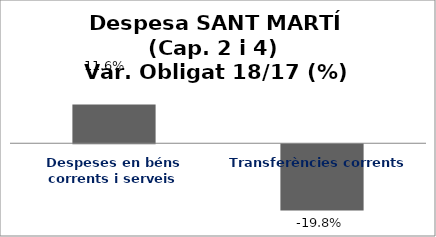
| Category | Series 0 |
|---|---|
| Despeses en béns corrents i serveis | 0.116 |
| Transferències corrents | -0.198 |